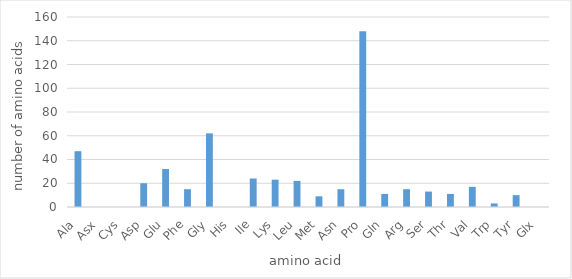
| Category | Series 0 |
|---|---|
| Ala | 47 |
| Asx | 0 |
| Cys | 0 |
| Asp | 20 |
| Glu | 32 |
| Phe | 15 |
| Gly | 62 |
| His | 0 |
| Ile | 24 |
| Lys | 23 |
| Leu | 22 |
| Met | 9 |
| Asn | 15 |
| Pro | 148 |
| Gln | 11 |
| Arg | 15 |
| Ser | 13 |
| Thr | 11 |
| Val | 17 |
| Trp | 3 |
| Tyr | 10 |
| Glx | 0 |